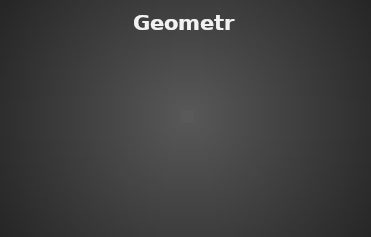
| Category | Geometry |
|---|---|
| % of Students passed | 0 |
| % of Students need improvement | 0 |